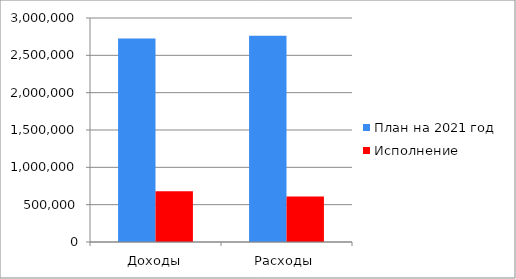
| Category | План на 2021 год | Исполнение |
|---|---|---|
| Доходы | 2724094.6 | 681198.01 |
| Расходы | 2763846.4 | 609164.7 |